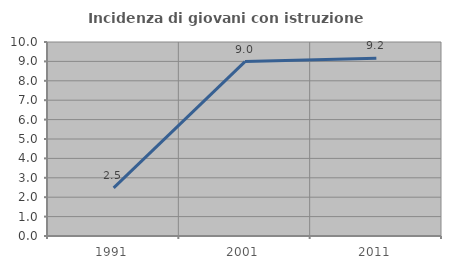
| Category | Incidenza di giovani con istruzione universitaria |
|---|---|
| 1991.0 | 2.479 |
| 2001.0 | 8.989 |
| 2011.0 | 9.16 |